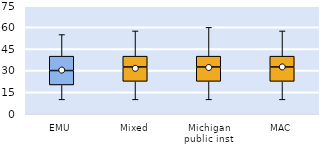
| Category | 25th | 50th | 75th |
|---|---|---|---|
| EMU | 20 | 10 | 10 |
| Mixed | 22.5 | 10 | 7.5 |
| Michigan public inst | 22.5 | 10 | 7.5 |
| MAC | 22.5 | 10 | 7.5 |